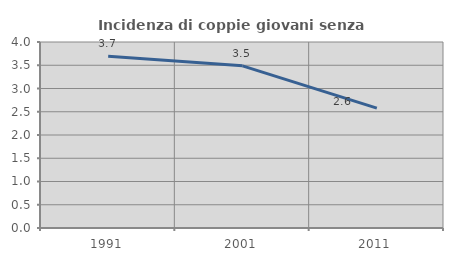
| Category | Incidenza di coppie giovani senza figli |
|---|---|
| 1991.0 | 3.693 |
| 2001.0 | 3.487 |
| 2011.0 | 2.578 |